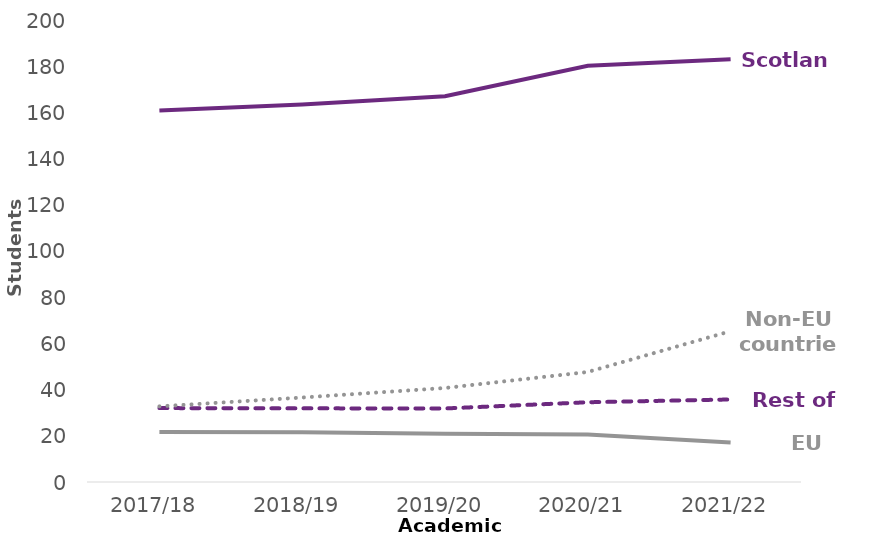
| Category | Scotland | Rest of UK | EU countries | Non-EU countries |
|---|---|---|---|---|
| 2017/18 | 160875 | 31995 | 21605 | 32740 |
| 2018/19 | 163470 | 31885 | 21505 | 36570 |
| 2019/20 | 167030 | 31835 | 20895 | 40695 |
| 2020/21 | 180170 | 34525 | 20550 | 47630 |
| 2021/22 | 183025 | 35730 | 17140 | 65300 |